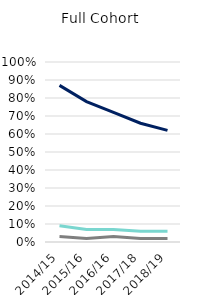
| Category | Employed | Self-Employed | Both |
|---|---|---|---|
| 2014/15 | 0.87 | 0.09 | 0.03 |
| 2015/16 | 0.78 | 0.07 | 0.02 |
| 2016/16 | 0.72 | 0.07 | 0.03 |
| 2017/18 | 0.66 | 0.06 | 0.02 |
| 2018/19 | 0.62 | 0.06 | 0.02 |